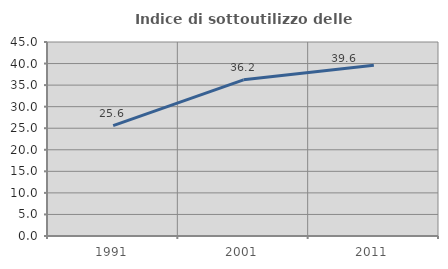
| Category | Indice di sottoutilizzo delle abitazioni  |
|---|---|
| 1991.0 | 25.586 |
| 2001.0 | 36.233 |
| 2011.0 | 39.585 |